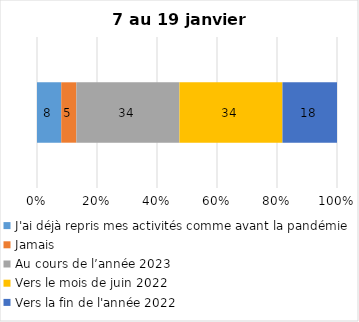
| Category | J'ai déjà repris mes activités comme avant la pandémie | Jamais | Au cours de l’année 2023 | Vers le mois de juin 2022 | Vers la fin de l'année 2022 |
|---|---|---|---|---|---|
| 0 | 8 | 5 | 34 | 34 | 18 |